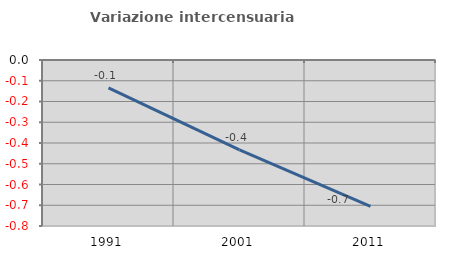
| Category | Variazione intercensuaria annua |
|---|---|
| 1991.0 | -0.134 |
| 2001.0 | -0.434 |
| 2011.0 | -0.705 |